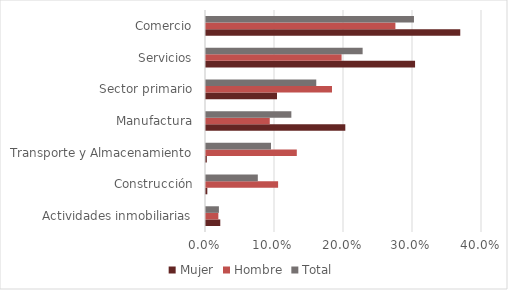
| Category | Mujer | Hombre | Total |
|---|---|---|---|
| Actividades inmobiliarias | 0.021 | 0.018 | 0.019 |
| Construcción | 0.002 | 0.104 | 0.075 |
| Transporte y Almacenamiento | 0.001 | 0.132 | 0.094 |
| Manufactura | 0.202 | 0.092 | 0.124 |
| Sector primario | 0.103 | 0.183 | 0.16 |
| Servicios | 0.303 | 0.196 | 0.227 |
| Comercio | 0.368 | 0.274 | 0.301 |